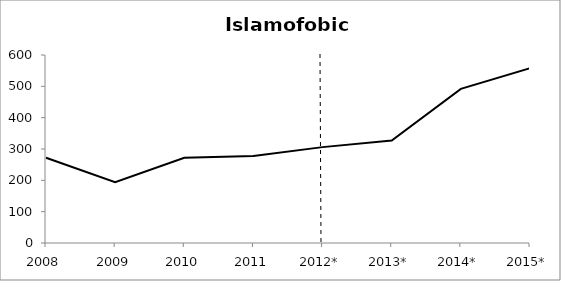
| Category | Series 0 |
|---|---|
| 2008 | 272 |
| 2009 | 194 |
| 2010 | 272 |
| 2011 | 278 |
| 2012* | 306 |
| 2013* | 327 |
| 2014* | 492 |
| 2015* | 558 |